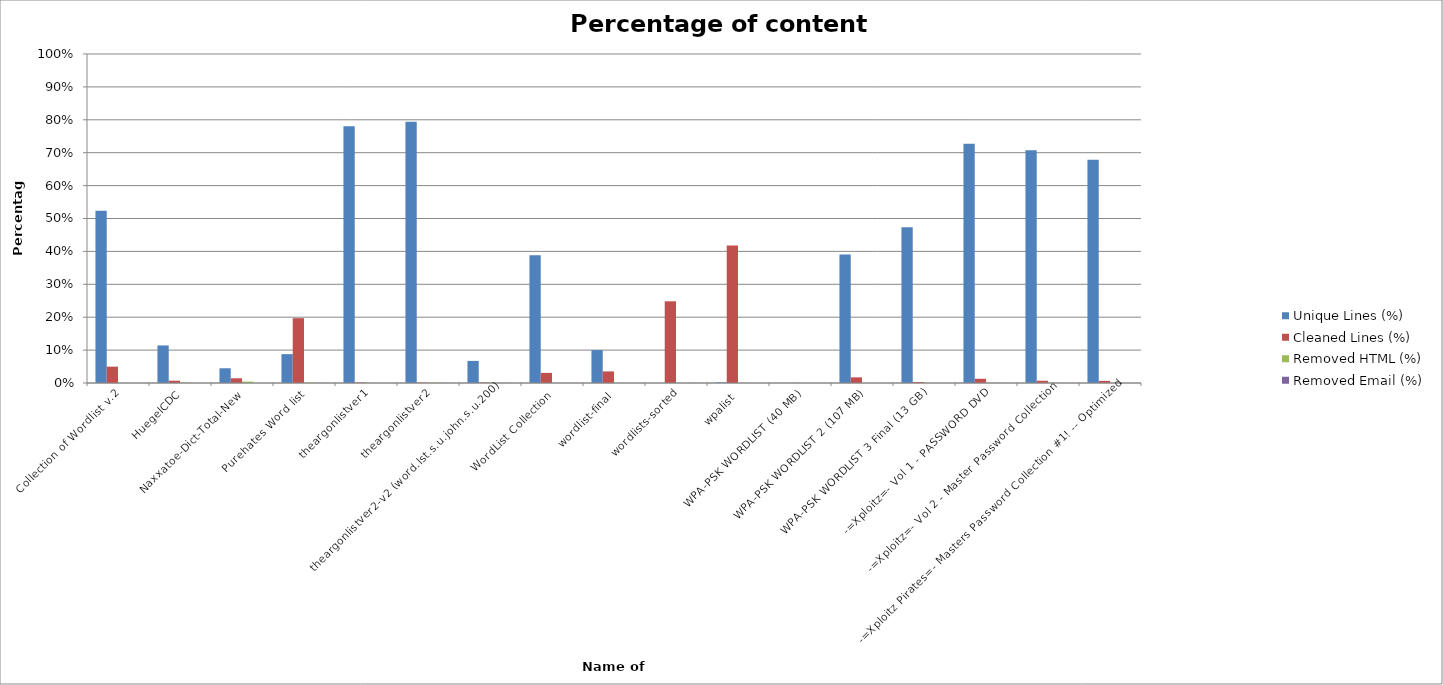
| Category | Unique Lines (%) | Cleaned Lines (%) | Removed HTML (%) | Removed Email (%) |
|---|---|---|---|---|
| Collection of Wordlist v.2 | 0.523 | 0.05 | 0 | 0 |
| HuegelCDC | 0.114 | 0.007 | 0.001 | 0 |
| Naxxatoe-Dict-Total-New | 0.045 | 0.014 | 0.004 | 0 |
| Purehates Word list | 0.088 | 0.197 | 0.002 | 0 |
| theargonlistver1 | 0.781 | 0.002 | 0 | 0 |
| theargonlistver2 | 0.794 | 0.001 | 0.001 | 0 |
| theargonlistver2-v2 (word.lst.s.u.john.s.u.200) | 0.067 | 0.001 | 0.001 | 0 |
| WordList Collection | 0.389 | 0.031 | 0 | 0 |
| wordlist-final | 0.1 | 0.035 | 0 | 0 |
| wordlists-sorted | 0 | 0.248 | 0 | 0 |
| wpalist | 0.002 | 0.418 | 0 | 0 |
| WPA-PSK WORDLIST (40 MB) | 0 | 0 | 0 | 0 |
| WPA-PSK WORDLIST 2 (107 MB) | 0.39 | 0.017 | 0 | 0 |
| WPA-PSK WORDLIST 3 Final (13 GB) | 0.474 | 0.003 | 0 | 0 |
| -=Xploitz=- Vol 1 - PASSWORD DVD | 0.727 | 0.013 | 0.001 | 0 |
| -=Xploitz=- Vol 2 - Master Password Collection | 0.708 | 0.007 | 0.001 | 0 |
| -=Xploitz Pirates=- Masters Password Collection #1! -- Optimized | 0.679 | 0.006 | 0 | 0 |